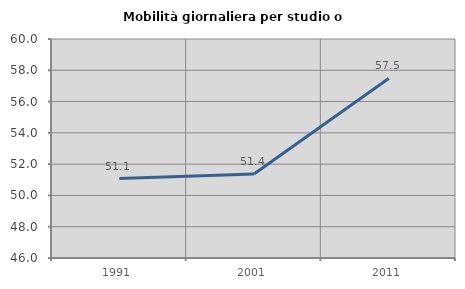
| Category | Mobilità giornaliera per studio o lavoro |
|---|---|
| 1991.0 | 51.077 |
| 2001.0 | 51.369 |
| 2011.0 | 57.478 |